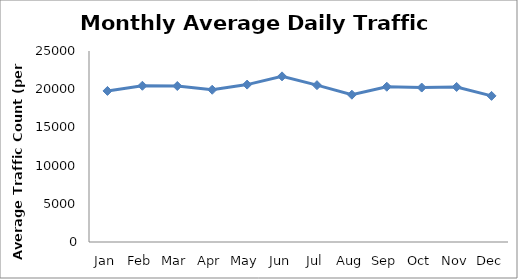
| Category | Series 0 |
|---|---|
| Jan | 19771.75 |
| Feb | 20447.75 |
| Mar | 20418 |
| Apr | 19929 |
| May | 20601 |
| Jun | 21679.5 |
| Jul | 20528 |
| Aug | 19279.75 |
| Sep | 20323.25 |
| Oct | 20215.75 |
| Nov | 20295.25 |
| Dec | 19125.5 |